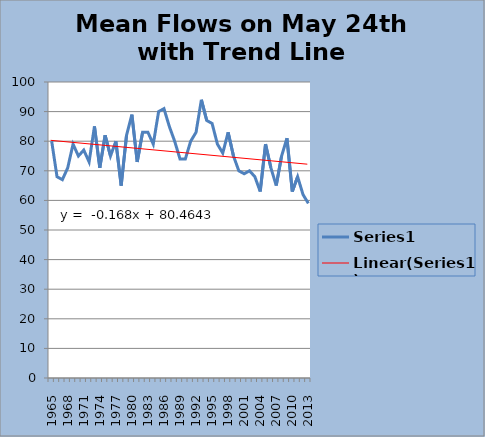
| Category | Series 0 |
|---|---|
| 1965.0 | 80 |
| 1966.0 | 68 |
| 1967.0 | 67 |
| 1968.0 | 71 |
| 1969.0 | 79 |
| 1970.0 | 75 |
| 1971.0 | 77 |
| 1972.0 | 73 |
| 1973.0 | 85 |
| 1974.0 | 71 |
| 1975.0 | 82 |
| 1976.0 | 75 |
| 1977.0 | 80 |
| 1978.0 | 65 |
| 1979.0 | 82 |
| 1980.0 | 89 |
| 1981.0 | 73 |
| 1982.0 | 83 |
| 1983.0 | 83 |
| 1984.0 | 79 |
| 1985.0 | 90 |
| 1986.0 | 91 |
| 1987.0 | 85 |
| 1988.0 | 80 |
| 1989.0 | 74 |
| 1990.0 | 74 |
| 1991.0 | 80 |
| 1992.0 | 83 |
| 1993.0 | 94 |
| 1994.0 | 87 |
| 1995.0 | 86 |
| 1996.0 | 79 |
| 1997.0 | 76 |
| 1998.0 | 83 |
| 1999.0 | 75 |
| 2000.0 | 70 |
| 2001.0 | 69 |
| 2002.0 | 70 |
| 2003.0 | 68 |
| 2004.0 | 63 |
| 2005.0 | 79 |
| 2006.0 | 71 |
| 2007.0 | 65 |
| 2008.0 | 75 |
| 2009.0 | 81 |
| 2010.0 | 63 |
| 2011.0 | 68 |
| 2012.0 | 62 |
| 2013.0 | 59 |